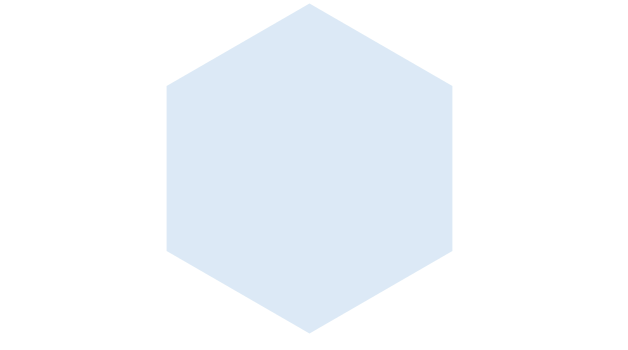
| Category | Series 1 | Series 0 |
|---|---|---|
|  | 5 |  |
|  | 5 |  |
|  | 5 |  |
|  | 5 |  |
|  | 5 |  |
|  | 5 |  |